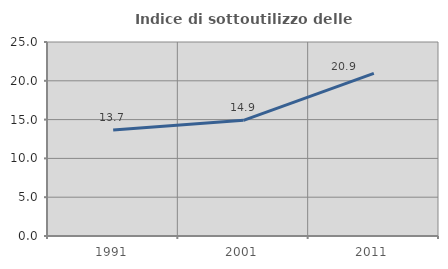
| Category | Indice di sottoutilizzo delle abitazioni  |
|---|---|
| 1991.0 | 13.675 |
| 2001.0 | 14.903 |
| 2011.0 | 20.949 |